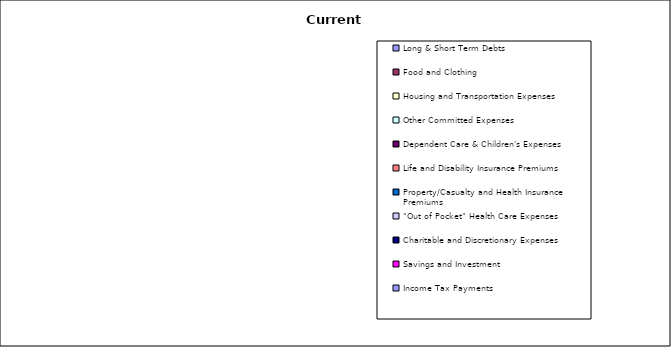
| Category | Series 0 |
|---|---|
| Long & Short Term Debts | 0 |
| Food and Clothing | 0 |
| Housing and Transportation Expenses | 0 |
| Other Committed Expenses | 0 |
| Dependent Care & Children's Expenses | 0 |
| Life and Disability Insurance Premiums | 0 |
| Property/Casualty and Health Insurance Premiums | 0 |
| "Out of Pocket" Health Care Expenses | 0 |
| Charitable and Discretionary Expenses | 0 |
| Savings and Investment | 0 |
| Income Tax Payments | 0 |